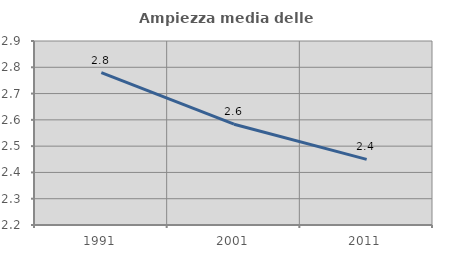
| Category | Ampiezza media delle famiglie |
|---|---|
| 1991.0 | 2.78 |
| 2001.0 | 2.583 |
| 2011.0 | 2.45 |